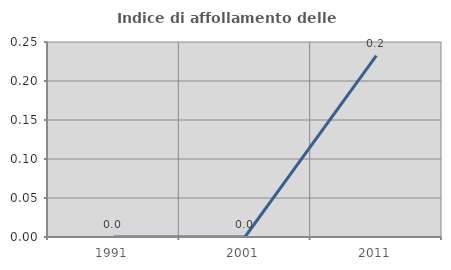
| Category | Indice di affollamento delle abitazioni  |
|---|---|
| 1991.0 | 0 |
| 2001.0 | 0 |
| 2011.0 | 0.233 |